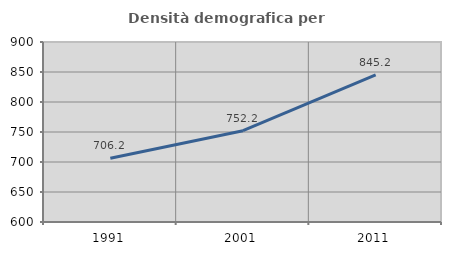
| Category | Densità demografica |
|---|---|
| 1991.0 | 706.175 |
| 2001.0 | 752.183 |
| 2011.0 | 845.154 |